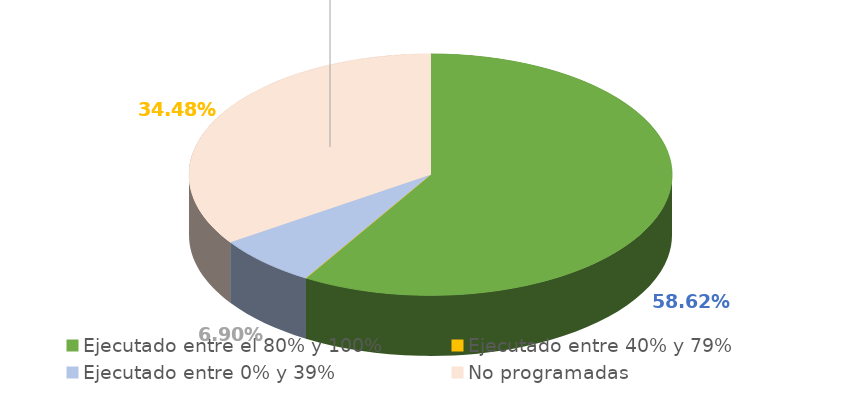
| Category | Series 0 |
|---|---|
| Ejecutado entre el 80% y 100% | 0.586 |
| Ejecutado entre 40% y 79% | 0 |
| Ejecutado entre 0% y 39% | 0.069 |
| No programadas | 0.345 |